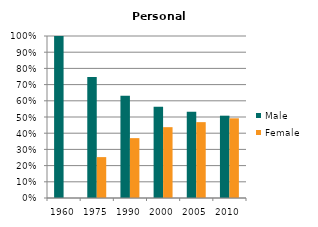
| Category | Male | Female |
|---|---|---|
| 1960.0 | 1 | 0 |
| 1975.0 | 0.748 | 0.252 |
| 1990.0 | 0.63 | 0.37 |
| 2000.0 | 0.563 | 0.437 |
| 2005.0 | 0.532 | 0.468 |
| 2010.0 | 0.508 | 0.492 |